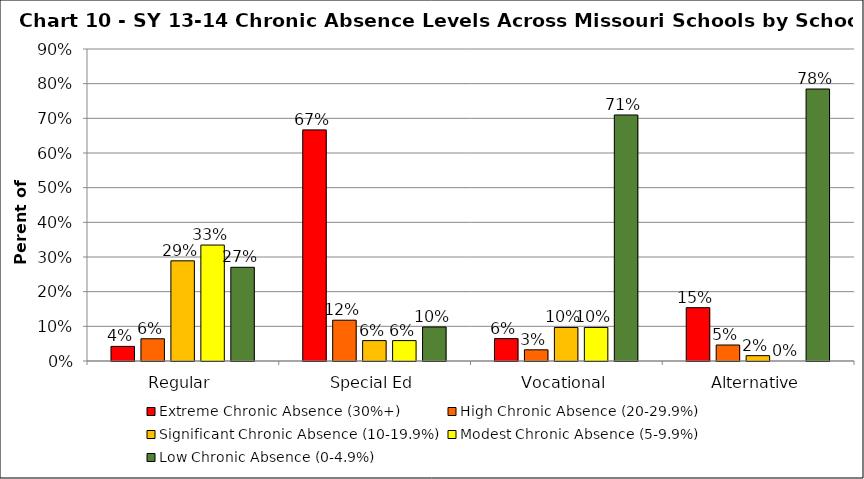
| Category | Extreme Chronic Absence (30%+) | High Chronic Absence (20-29.9%) | Significant Chronic Absence (10-19.9%) | Modest Chronic Absence (5-9.9%) | Low Chronic Absence (0-4.9%) |
|---|---|---|---|---|---|
| 0 | 0.042 | 0.064 | 0.289 | 0.334 | 0.27 |
| 1 | 0.667 | 0.118 | 0.059 | 0.059 | 0.098 |
| 2 | 0.065 | 0.032 | 0.097 | 0.097 | 0.71 |
| 3 | 0.154 | 0.046 | 0.015 | 0 | 0.785 |